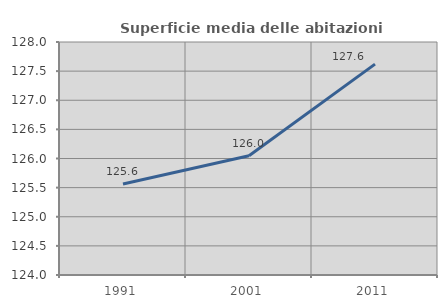
| Category | Superficie media delle abitazioni occupate |
|---|---|
| 1991.0 | 125.563 |
| 2001.0 | 126.046 |
| 2011.0 | 127.621 |